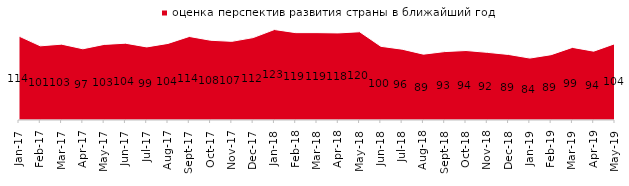
| Category | оценка перспектив развития страны в ближайший год |
|---|---|
| 2017-01-01 | 114 |
| 2017-02-01 | 100.75 |
| 2017-03-01 | 103.05 |
| 2017-04-01 | 96.75 |
| 2017-05-01 | 102.7 |
| 2017-06-01 | 104.35 |
| 2017-07-01 | 99.3 |
| 2017-08-01 | 104.05 |
| 2017-09-01 | 113.5 |
| 2017-10-01 | 108.35 |
| 2017-11-01 | 106.85 |
| 2017-12-01 | 111.95 |
| 2018-01-01 | 122.9 |
| 2018-02-01 | 118.7 |
| 2018-03-01 | 118.7 |
| 2018-04-01 | 118.3 |
| 2018-05-01 | 119.9 |
| 2018-06-01 | 100.1 |
| 2018-07-01 | 96.2 |
| 2018-08-01 | 89.45 |
| 2018-09-01 | 92.95 |
| 2018-10-01 | 94.4 |
| 2018-11-01 | 91.916 |
| 2018-12-01 | 89.05 |
| 2019-01-01 | 84.15 |
| 2019-02-01 | 88.75 |
| 2019-03-01 | 98.657 |
| 2019-04-01 | 93.515 |
| 2019-05-01 | 103.764 |